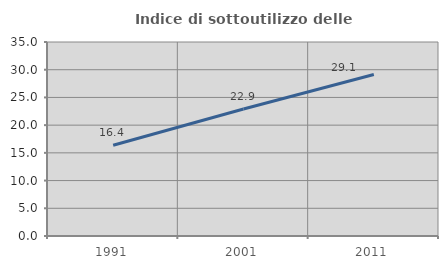
| Category | Indice di sottoutilizzo delle abitazioni  |
|---|---|
| 1991.0 | 16.384 |
| 2001.0 | 22.917 |
| 2011.0 | 29.138 |